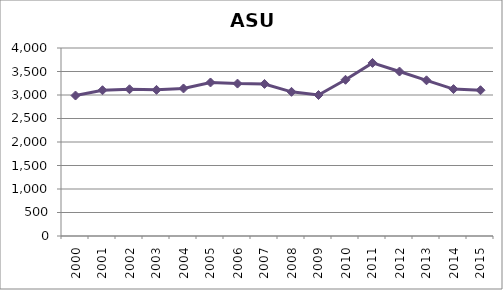
| Category | Series 0 |
|---|---|
| 2000.0 | 2989.017 |
| 2001.0 | 3101.15 |
| 2002.0 | 3122.2 |
| 2003.0 | 3109.283 |
| 2004.0 | 3138.967 |
| 2005.0 | 3266.308 |
| 2006.0 | 3242.942 |
| 2007.0 | 3235.117 |
| 2008.0 | 3067.425 |
| 2009.0 | 2999.642 |
| 2010.0 | 3324.117 |
| 2011.0 | 3682.492 |
| 2012.0 | 3499.117 |
| 2013.0 | 3312.65 |
| 2014.0 | 3125.6 |
| 2015.0 | 3101.192 |